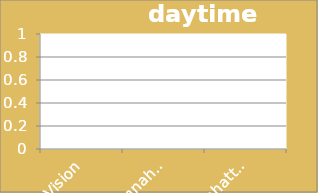
| Category | daytime density |
|---|---|
| 0's Vision | 0 |
| Mannahatta (1609) | 0 |
| Manhattan (2010) | 0 |